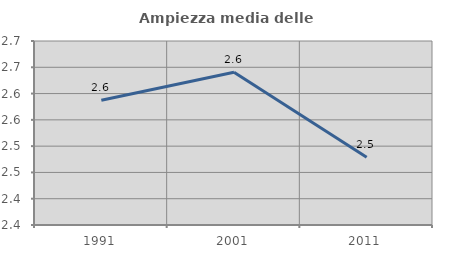
| Category | Ampiezza media delle famiglie |
|---|---|
| 1991.0 | 2.587 |
| 2001.0 | 2.641 |
| 2011.0 | 2.479 |